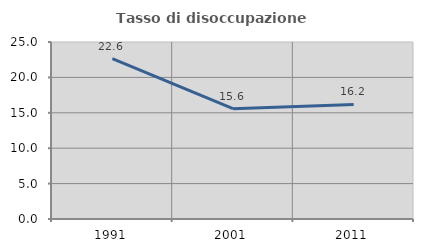
| Category | Tasso di disoccupazione giovanile  |
|---|---|
| 1991.0 | 22.642 |
| 2001.0 | 15.584 |
| 2011.0 | 16.176 |